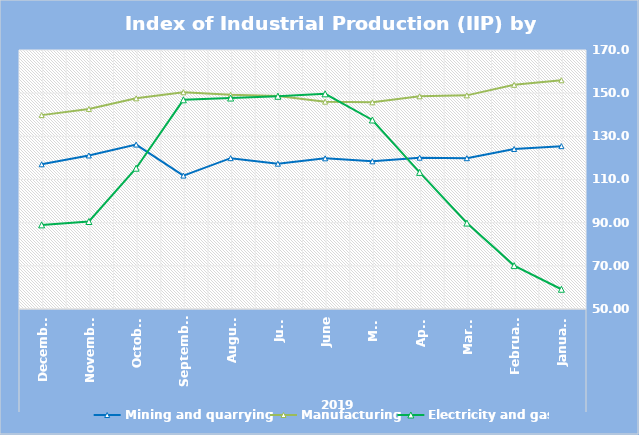
| Category | Mining and quarrying   | Manufacturing | Electricity and gas |
|---|---|---|---|
| 0 | 125.45 | 155.98 | 59.15 |
| 1 | 124.14 | 153.87 | 70.1 |
| 2 | 119.87 | 148.98 | 89.82 |
| 3 | 120.11 | 148.54 | 113.29 |
| 4 | 118.43 | 145.76 | 137.57 |
| 5 | 119.81 | 146.05 | 149.7 |
| 6 | 117.33 | 148.68 | 148.56 |
| 7 | 119.89 | 149.23 | 147.74 |
| 8 | 111.81 | 150.42 | 146.92 |
| 9 | 126.188 | 147.61 | 115.237 |
| 10 | 121.13 | 142.69 | 90.54 |
| 11 | 117.05 | 139.83 | 88.97 |